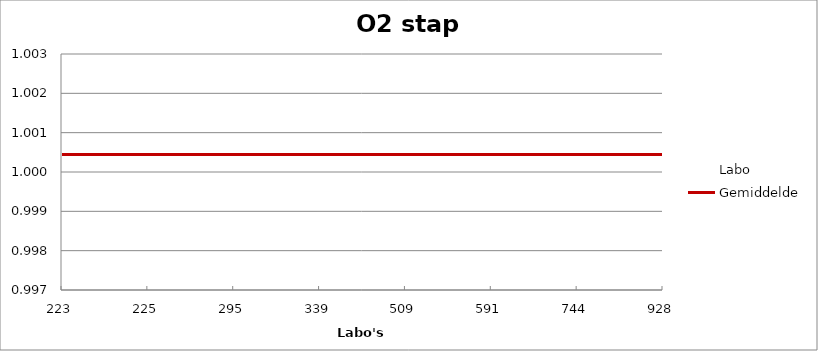
| Category | Labo | Gemiddelde |
|---|---|---|
| 223.0 | 1 | 1 |
| 225.0 | 1.002 | 1 |
| 295.0 | 1 | 1 |
| 339.0 | 1.003 | 1 |
| 509.0 | 0.999 | 1 |
| 591.0 | 1 | 1 |
| 744.0 | 0.999 | 1 |
| 928.0 | 1.001 | 1 |